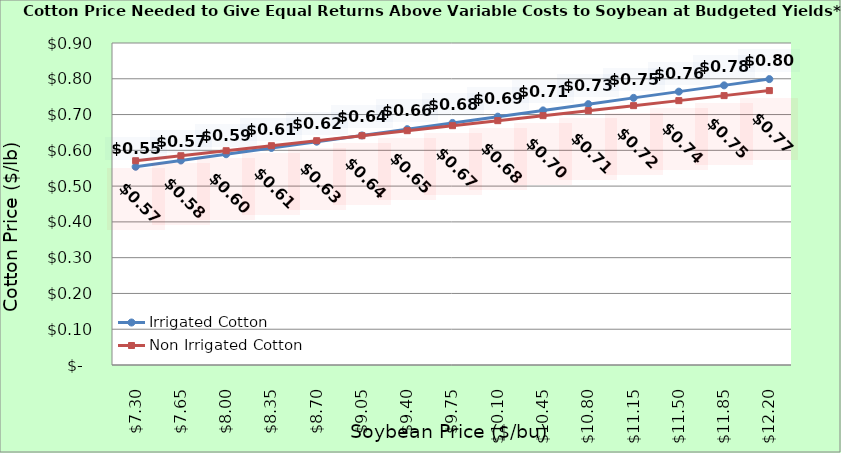
| Category | Irrigated Cotton | Non Irrigated Cotton |
|---|---|---|
| 7.3000000000000025 | 0.554 | 0.571 |
| 7.650000000000002 | 0.572 | 0.585 |
| 8.000000000000002 | 0.589 | 0.599 |
| 8.350000000000001 | 0.607 | 0.613 |
| 8.700000000000001 | 0.624 | 0.627 |
| 9.05 | 0.642 | 0.641 |
| 9.4 | 0.659 | 0.655 |
| 9.75 | 0.677 | 0.669 |
| 10.1 | 0.694 | 0.683 |
| 10.45 | 0.712 | 0.697 |
| 10.799999999999999 | 0.729 | 0.711 |
| 11.149999999999999 | 0.747 | 0.725 |
| 11.499999999999998 | 0.764 | 0.739 |
| 11.849999999999998 | 0.782 | 0.753 |
| 12.199999999999998 | 0.799 | 0.767 |